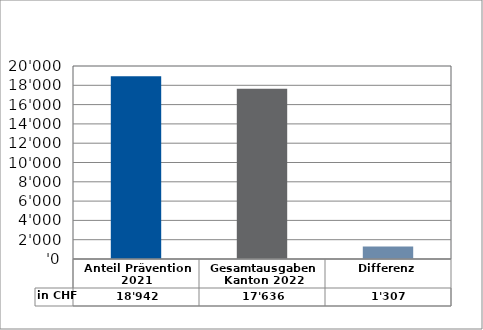
| Category | in CHF |
|---|---|
| Anteil Prävention 2021

 | 18942.35 |
| Gesamtausgaben Kanton 2022
 | 17635.6 |
| Differenz | 1306.75 |